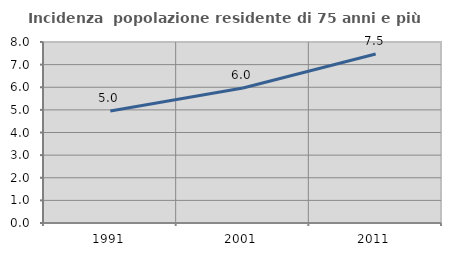
| Category | Incidenza  popolazione residente di 75 anni e più |
|---|---|
| 1991.0 | 4.951 |
| 2001.0 | 5.965 |
| 2011.0 | 7.47 |